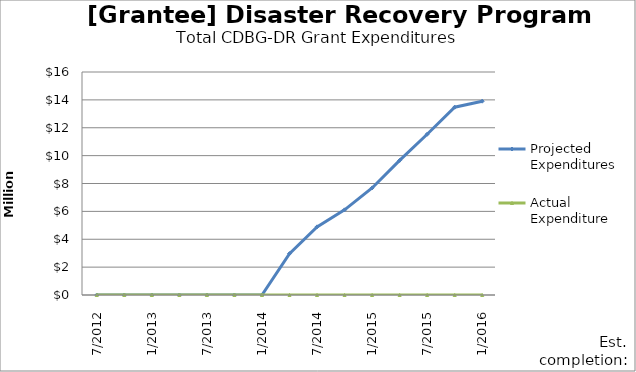
| Category | Projected Expenditures | Actual Expenditure |
|---|---|---|
| 7/2012 | 0 | 0 |
| 10/2012 | 0 | 0 |
| 1/2013 | 0 | 0 |
| 4/2013 | 0 | 0 |
| 7/2013 | 0 | 0 |
| 10/2013 | 0 | 0 |
| 1/2014 | 0 | 0 |
| 4/2014 | 2970000 | 0 |
| 7/2014 | 4888600 | 0 |
| 10/2014 | 6110000 | 0 |
| 1/2015 | 7681000 | 0 |
| 4/2015 | 9658000 | 0 |
| 7/2015 | 11536000 | 0 |
| 10/2015 | 13476000 | 0 |
| 1/2016 | 13906000 | 0 |